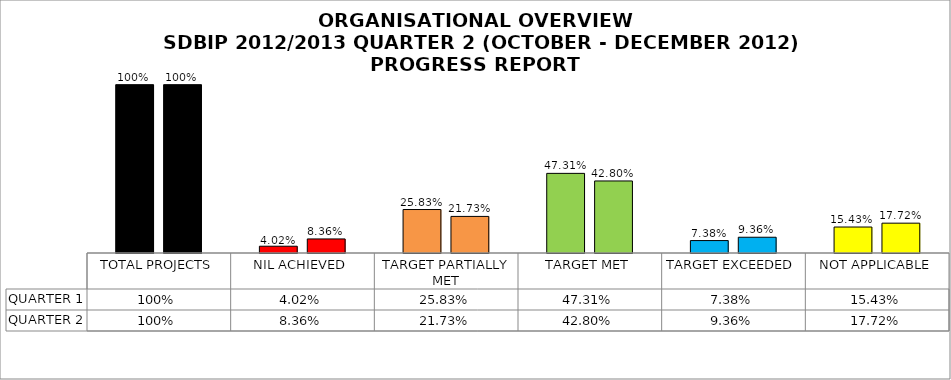
| Category | QUARTER 1 | QUARTER 2 |
|---|---|---|
| TOTAL PROJECTS | 1 | 1 |
| NIL ACHIEVED | 0.04 | 0.084 |
| TARGET PARTIALLY MET | 0.258 | 0.217 |
| TARGET MET | 0.473 | 0.428 |
| TARGET EXCEEDED | 0.074 | 0.094 |
| NOT APPLICABLE | 0.154 | 0.177 |